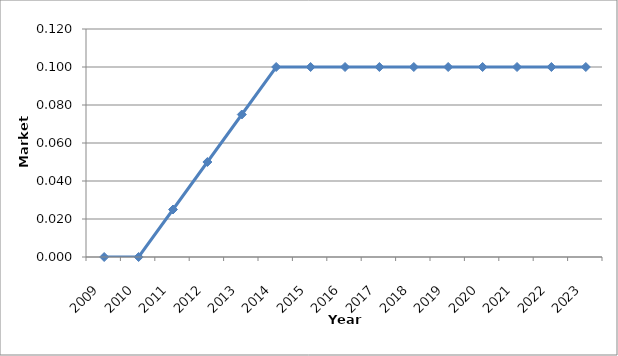
| Category | Series 0 |
|---|---|
| 2009.0 | 0 |
| 2010.0 | 0 |
| 2011.0 | 0.025 |
| 2012.0 | 0.05 |
| 2013.0 | 0.075 |
| 2014.0 | 0.1 |
| 2015.0 | 0.1 |
| 2016.0 | 0.1 |
| 2017.0 | 0.1 |
| 2018.0 | 0.1 |
| 2019.0 | 0.1 |
| 2020.0 | 0.1 |
| 2021.0 | 0.1 |
| 2022.0 | 0.1 |
| 2023.0 | 0.1 |